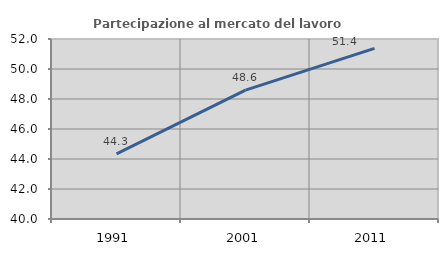
| Category | Partecipazione al mercato del lavoro  femminile |
|---|---|
| 1991.0 | 44.347 |
| 2001.0 | 48.589 |
| 2011.0 | 51.371 |